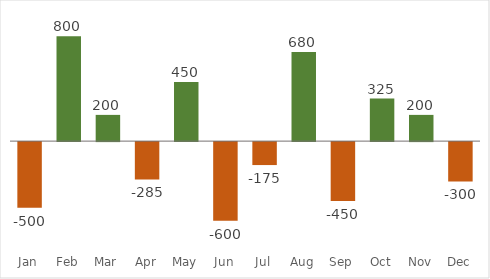
| Category | Variance |
|---|---|
| Jan | -500 |
| Feb | 800 |
| Mar | 200 |
| Apr | -285 |
| May | 450 |
| Jun | -600 |
| Jul | -175 |
| Aug | 680 |
| Sep | -450 |
| Oct | 325 |
| Nov | 200 |
| Dec | -300 |